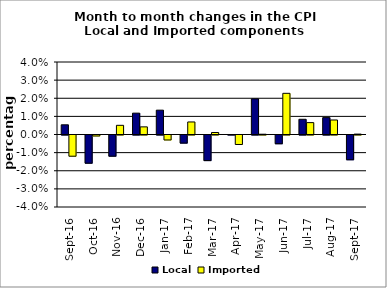
| Category | Local | Imported |
|---|---|---|
| 2016-09-01 | 0.005 | -0.012 |
| 2016-10-01 | -0.016 | -0.001 |
| 2016-11-01 | -0.012 | 0.005 |
| 2016-12-01 | 0.012 | 0.004 |
| 2017-01-01 | 0.013 | -0.003 |
| 2017-02-01 | -0.004 | 0.007 |
| 2017-03-01 | -0.014 | 0.001 |
| 2017-04-01 | 0 | -0.005 |
| 2017-05-01 | 0.02 | 0 |
| 2017-06-01 | -0.005 | 0.023 |
| 2017-07-01 | 0.008 | 0.007 |
| 2017-08-01 | 0.009 | 0.008 |
| 2017-09-01 | -0.014 | 0 |